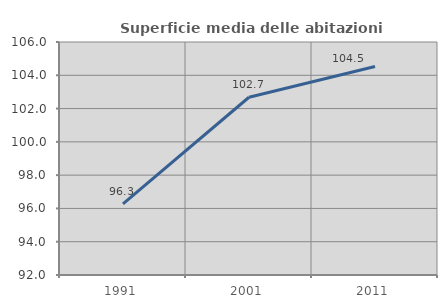
| Category | Superficie media delle abitazioni occupate |
|---|---|
| 1991.0 | 96.272 |
| 2001.0 | 102.68 |
| 2011.0 | 104.527 |